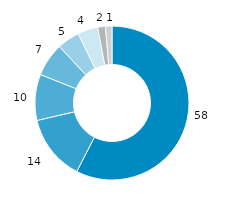
| Category | Schleswig-Holstein |
|---|---|
| 0 | 57.558 |
| 1 | 13.805 |
| 2 | 9.673 |
| 3 | 7.032 |
| 4 | 4.712 |
| 5 | 4.239 |
| 6 | 1.624 |
| 7 | 1.356 |